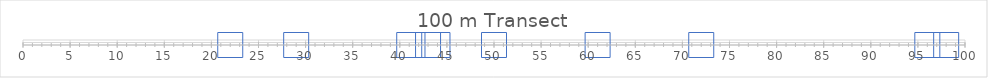
| Category | Series 0 |
|---|---|
| 98.0 | 0 |
| 44.0 | 0 |
| 96.0 | 0 |
| 41.0 | 0 |
| 72.0 | 0 |
| 43.0 | 0 |
| 61.0 | 0 |
| 29.0 | 0 |
| 22.0 | 0 |
| 50.0 | 0 |